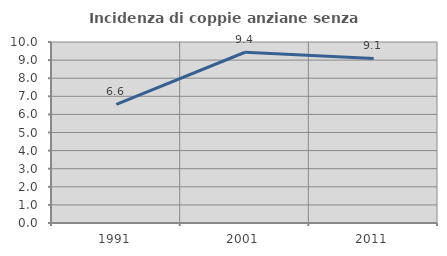
| Category | Incidenza di coppie anziane senza figli  |
|---|---|
| 1991.0 | 6.557 |
| 2001.0 | 9.434 |
| 2011.0 | 9.091 |